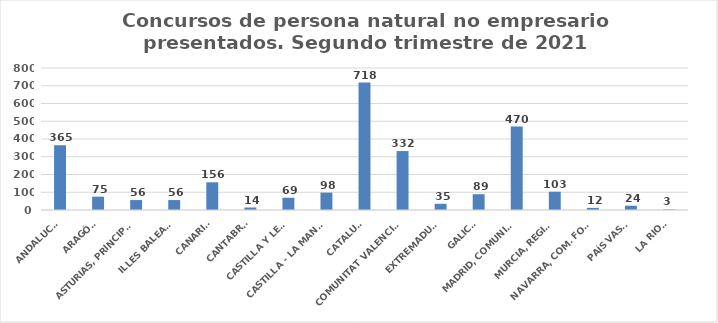
| Category | Series 0 |
|---|---|
| ANDALUCÍA | 365 |
| ARAGÓN | 75 |
| ASTURIAS, PRINCIPADO | 56 |
| ILLES BALEARS | 56 |
| CANARIAS | 156 |
| CANTABRIA | 14 |
| CASTILLA Y LEÓN | 69 |
| CASTILLA - LA MANCHA | 98 |
| CATALUÑA | 718 |
| COMUNITAT VALENCIANA | 332 |
| EXTREMADURA | 35 |
| GALICIA | 89 |
| MADRID, COMUNIDAD | 470 |
| MURCIA, REGIÓN | 103 |
| NAVARRA, COM. FORAL | 12 |
| PAÍS VASCO | 24 |
| LA RIOJA | 3 |